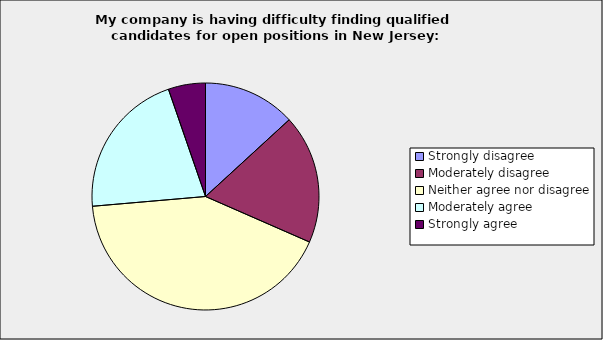
| Category | Series 0 |
|---|---|
| Strongly disagree | 0.132 |
| Moderately disagree | 0.184 |
| Neither agree nor disagree | 0.421 |
| Moderately agree | 0.211 |
| Strongly agree | 0.053 |